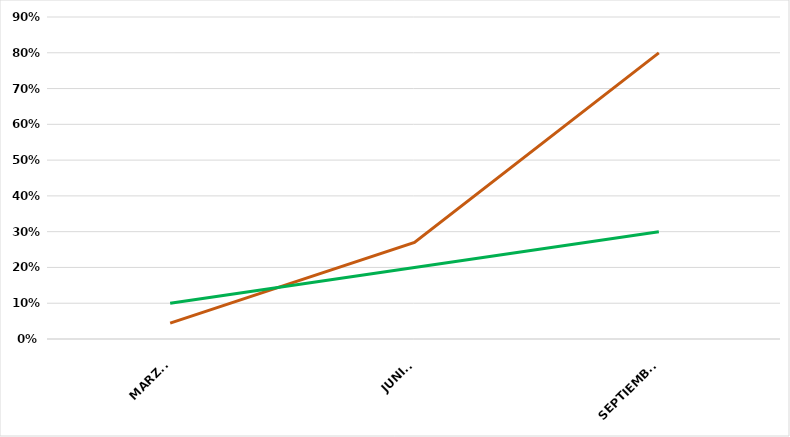
| Category | VALOR  | META PONDERADA |
|---|---|---|
| MARZO | 0.044 | 0.1 |
| JUNIO | 0.27 | 0.2 |
| SEPTIEMBRE | 0.8 | 0.3 |